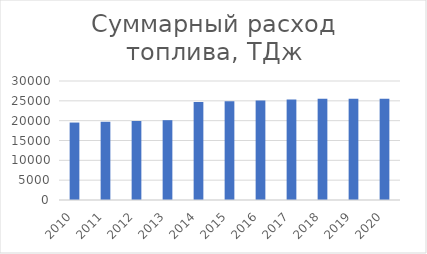
| Category | TДж |
|---|---|
| 2010.0 | 19525.278 |
| 2011.0 | 19722.503 |
| 2012.0 | 19921.72 |
| 2013.0 | 20122.949 |
| 2014.0 | 24693.968 |
| 2015.0 | 24899.283 |
| 2016.0 | 25106.672 |
| 2017.0 | 25316.156 |
| 2018.0 | 25527.756 |
| 2019.0 | 25527.756 |
| 2020.0 | 25527.756 |